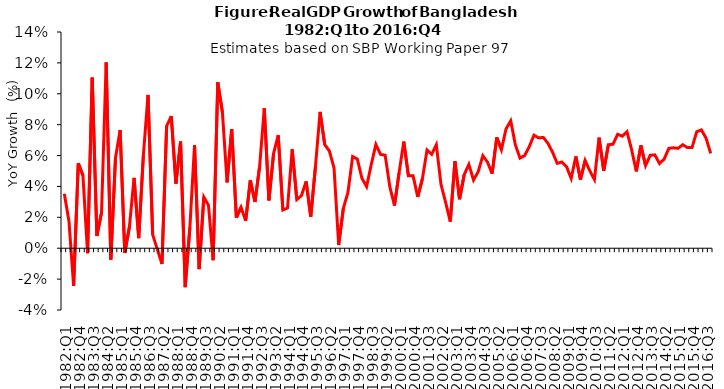
| Category | Series 0 |
|---|---|
| 1982:Q1 | 0.035 |
| 1982:Q2 | 0.017 |
| 1982:Q3 | -0.024 |
| 1982:Q4 | 0.055 |
| 1983:Q1 | 0.047 |
| 1983:Q2 | -0.003 |
| 1983:Q3 | 0.11 |
| 1983:Q4 | 0.008 |
| 1984:Q1 | 0.023 |
| 1984:Q2 | 0.12 |
| 1984:Q3 | -0.007 |
| 1984:Q4 | 0.058 |
| 1985:Q1 | 0.077 |
| 1985:Q2 | -0.003 |
| 1985:Q3 | 0.014 |
| 1985:Q4 | 0.046 |
| 1986:Q1 | 0.007 |
| 1986:Q2 | 0.06 |
| 1986:Q3 | 0.099 |
| 1986:Q4 | 0.009 |
| 1987:Q1 | -0.001 |
| 1987:Q2 | -0.01 |
| 1987:Q3 | 0.079 |
| 1987:Q4 | 0.085 |
| 1988:Q1 | 0.042 |
| 1988:Q2 | 0.069 |
| 1988:Q3 | -0.025 |
| 1988:Q4 | 0.013 |
| 1989:Q1 | 0.067 |
| 1989:Q2 | -0.014 |
| 1989:Q3 | 0.033 |
| 1989:Q4 | 0.028 |
| 1990:Q1 | -0.008 |
| 1990:Q2 | 0.107 |
| 1990:Q3 | 0.088 |
| 1990:Q4 | 0.043 |
| 1991:Q1 | 0.077 |
| 1991:Q2 | 0.02 |
| 1991:Q3 | 0.027 |
| 1991:Q4 | 0.018 |
| 1992:Q1 | 0.044 |
| 1992:Q2 | 0.03 |
| 1992:Q3 | 0.053 |
| 1992:Q4 | 0.091 |
| 1993:Q1 | 0.031 |
| 1993:Q2 | 0.061 |
| 1993:Q3 | 0.073 |
| 1993:Q4 | 0.025 |
| 1994:Q1 | 0.026 |
| 1994:Q2 | 0.064 |
| 1994:Q3 | 0.032 |
| 1994:Q4 | 0.034 |
| 1995:Q1 | 0.043 |
| 1995:Q2 | 0.02 |
| 1995:Q3 | 0.053 |
| 1995:Q4 | 0.088 |
| 1996:Q1 | 0.067 |
| 1996:Q2 | 0.063 |
| 1996:Q3 | 0.052 |
| 1996:Q4 | 0.002 |
| 1997:Q1 | 0.026 |
| 1997:Q2 | 0.036 |
| 1997:Q3 | 0.059 |
| 1997:Q4 | 0.058 |
| 1998:Q1 | 0.045 |
| 1998:Q2 | 0.04 |
| 1998:Q3 | 0.054 |
| 1998:Q4 | 0.067 |
| 1999:Q1 | 0.061 |
| 1999:Q2 | 0.06 |
| 1999:Q3 | 0.04 |
| 1999:Q4 | 0.028 |
| 2000:Q1 | 0.049 |
| 2000:Q2 | 0.069 |
| 2000:Q3 | 0.047 |
| 2000:Q4 | 0.047 |
| 2001:Q1 | 0.033 |
| 2001:Q2 | 0.045 |
| 2001:Q3 | 0.064 |
| 2001:Q4 | 0.061 |
| 2002:Q1 | 0.067 |
| 2002:Q2 | 0.041 |
| 2002:Q3 | 0.03 |
| 2002:Q4 | 0.017 |
| 2003:Q1 | 0.056 |
| 2003:Q2 | 0.032 |
| 2003:Q3 | 0.048 |
| 2003:Q4 | 0.054 |
| 2004:Q1 | 0.044 |
| 2004:Q2 | 0.05 |
| 2004:Q3 | 0.06 |
| 2004:Q4 | 0.056 |
| 2005:Q1 | 0.048 |
| 2005:Q2 | 0.072 |
| 2005:Q3 | 0.064 |
| 2005:Q4 | 0.077 |
| 2006:Q1 | 0.082 |
| 2006:Q2 | 0.067 |
| 2006:Q3 | 0.058 |
| 2006:Q4 | 0.06 |
| 2007:Q1 | 0.066 |
| 2007:Q2 | 0.073 |
| 2007:Q3 | 0.071 |
| 2007:Q4 | 0.072 |
| 2008:Q1 | 0.068 |
| 2008:Q2 | 0.062 |
| 2008:Q3 | 0.055 |
| 2008:Q4 | 0.056 |
| 2009:Q1 | 0.053 |
| 2009:Q2 | 0.045 |
| 2009:Q3 | 0.059 |
| 2009:Q4 | 0.044 |
| 2010:Q1 | 0.057 |
| 2010:Q2 | 0.05 |
| 2010:Q3 | 0.044 |
| 2010:Q4 | 0.072 |
| 2011:Q1 | 0.05 |
| 2011:Q2 | 0.067 |
| 2011:Q3 | 0.067 |
| 2011:Q4 | 0.074 |
| 2012:Q1 | 0.073 |
| 2012:Q2 | 0.075 |
| 2012:Q3 | 0.064 |
| 2012:Q4 | 0.05 |
| 2013:Q1 | 0.067 |
| 2013:Q2 | 0.054 |
| 2013:Q3 | 0.06 |
| 2013:Q4 | 0.06 |
| 2014:Q1 | 0.055 |
| 2014:Q2 | 0.058 |
| 2014:Q3 | 0.065 |
| 2014:Q4 | 0.065 |
| 2015:Q1 | 0.065 |
| 2015:Q2 | 0.067 |
| 2015:Q3 | 0.065 |
| 2015:Q4 | 0.065 |
| 2016:Q1 | 0.075 |
| 2016:Q2 | 0.077 |
| 2016:Q3 | 0.071 |
| 2016:Q4 | 0.061 |